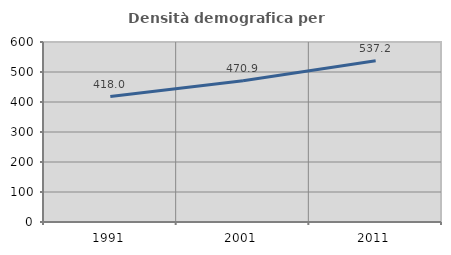
| Category | Densità demografica |
|---|---|
| 1991.0 | 417.971 |
| 2001.0 | 470.918 |
| 2011.0 | 537.198 |